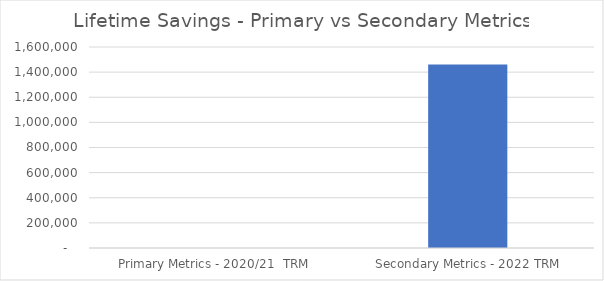
| Category | Series 0 |
|---|---|
|  Primary Metrics - 2020/21  TRM  | 0 |
|  Secondary Metrics - 2022 TRM  | 1461054.416 |